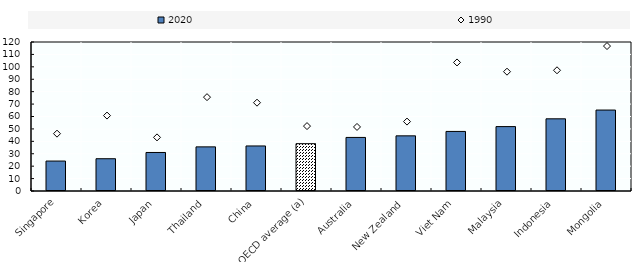
| Category | 2020 |
|---|---|
| Singapore | 24.112 |
| Korea | 25.994 |
| Japan | 31.032 |
| Thailand | 35.544 |
| China | 36.274 |
| OECD average (a) | 38.105 |
| Australia | 43.142 |
| New Zealand | 44.41 |
| Viet Nam | 47.979 |
| Malaysia | 51.86 |
| Indonesia | 58.136 |
| Mongolia | 65.188 |